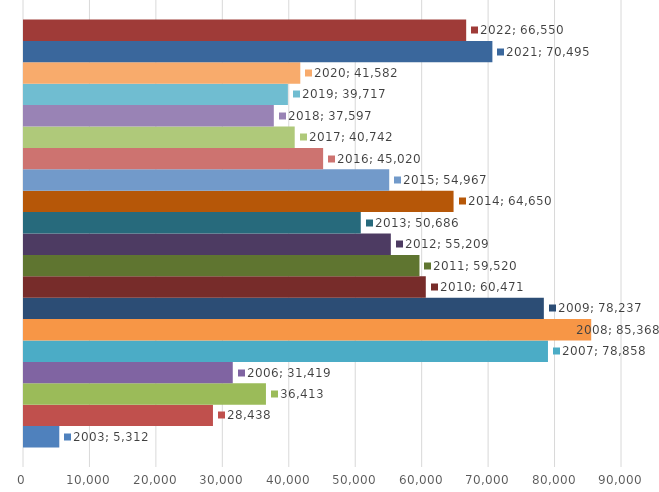
| Category | 2003 | 2004 | 2005 | 2006 | 2007 | 2008 | 2009 | 2010 | 2011 | 2012 | 2013 | 2014 | 2015 | 2016 | 2017 | 2018 | 2019 | 2020 | 2021 | 2022 |
|---|---|---|---|---|---|---|---|---|---|---|---|---|---|---|---|---|---|---|---|---|
| 0 | 5312 | 28438 | 36413 | 31419 | 78858 | 85368 | 78237 | 60471 | 59520 | 55209 | 50686 | 64650 | 54967 | 45020 | 40742 | 37597 | 39717 | 41582 | 70495 | 66550 |